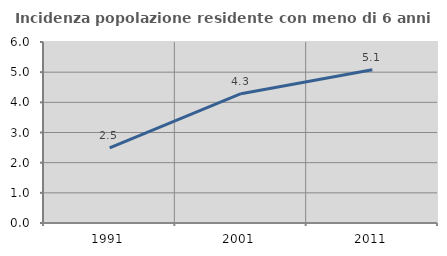
| Category | Incidenza popolazione residente con meno di 6 anni |
|---|---|
| 1991.0 | 2.493 |
| 2001.0 | 4.288 |
| 2011.0 | 5.082 |